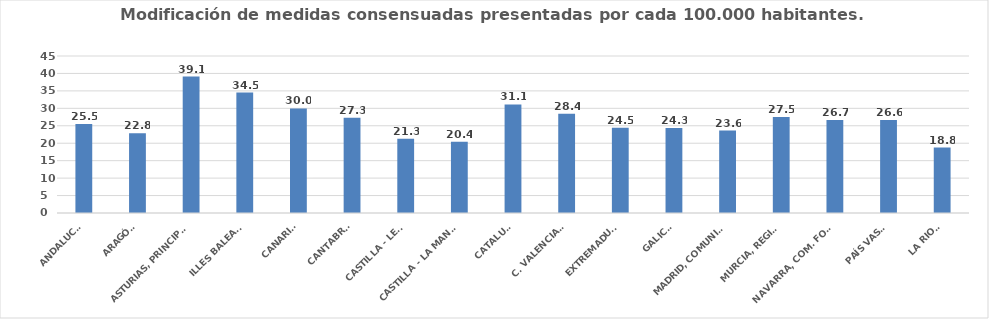
| Category | Series 0 |
|---|---|
| ANDALUCÍA | 25.541 |
| ARAGÓN | 22.845 |
| ASTURIAS, PRINCIPADO | 39.117 |
| ILLES BALEARS | 34.504 |
| CANARIAS | 29.986 |
| CANTABRIA | 27.332 |
| CASTILLA - LEÓN | 21.284 |
| CASTILLA - LA MANCHA | 20.406 |
| CATALUÑA | 31.106 |
| C. VALENCIANA | 28.443 |
| EXTREMADURA | 24.46 |
| GALICIA | 24.345 |
| MADRID, COMUNIDAD | 23.628 |
| MURCIA, REGIÓN | 27.483 |
| NAVARRA, COM. FORAL | 26.652 |
| PAÍS VASCO | 26.628 |
| LA RIOJA | 18.756 |